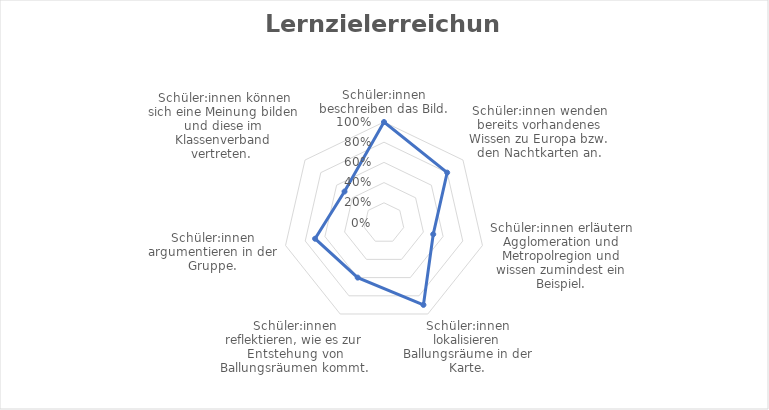
| Category | Erreicht |
|---|---|
| Schüler:innen beschreiben das Bild. | 1 |
| Schüler:innen wenden bereits vorhandenes Wissen zu Europa bzw. den Nachtkarten an. | 0.8 |
| Schüler:innen erläutern Agglomeration und Metropolregion und wissen zumindest ein Beispiel. | 0.5 |
| Schüler:innen lokalisieren Ballungsräume in der Karte. | 0.9 |
| Schüler:innen reflektieren, wie es zur Entstehung von Ballungsräumen kommt. | 0.6 |
| Schüler:innen argumentieren in der Gruppe. | 0.7 |
| Schüler:innen können sich eine Meinung bilden und diese im Klassenverband vertreten.  | 0.5 |